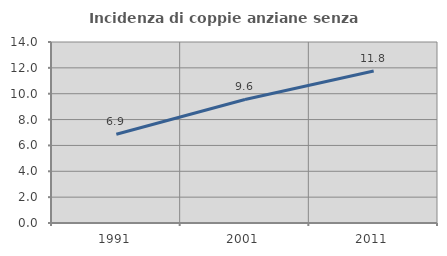
| Category | Incidenza di coppie anziane senza figli  |
|---|---|
| 1991.0 | 6.865 |
| 2001.0 | 9.554 |
| 2011.0 | 11.75 |